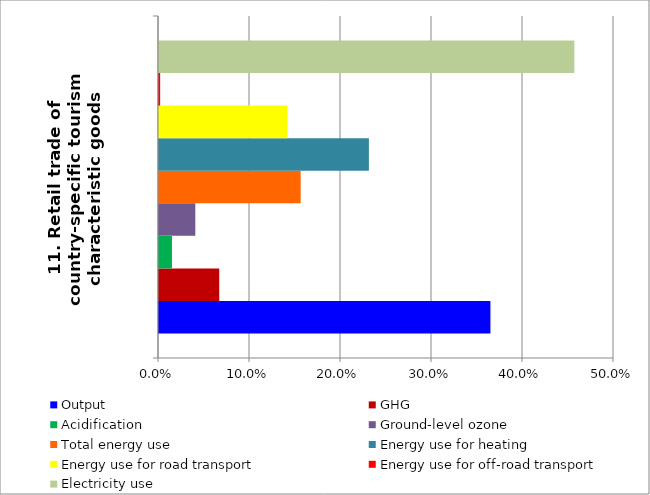
| Category | Output | GHG | Acidification | Ground-level ozone | Total energy use | Energy use for heating | Energy use for road transport | Energy use for off-road transport | Electricity use |
|---|---|---|---|---|---|---|---|---|---|
| 11. Retail trade of country-specific tourism characteristic goods | 0.364 | 0.066 | 0.014 | 0.04 | 0.156 | 0.231 | 0.141 | 0.001 | 0.456 |